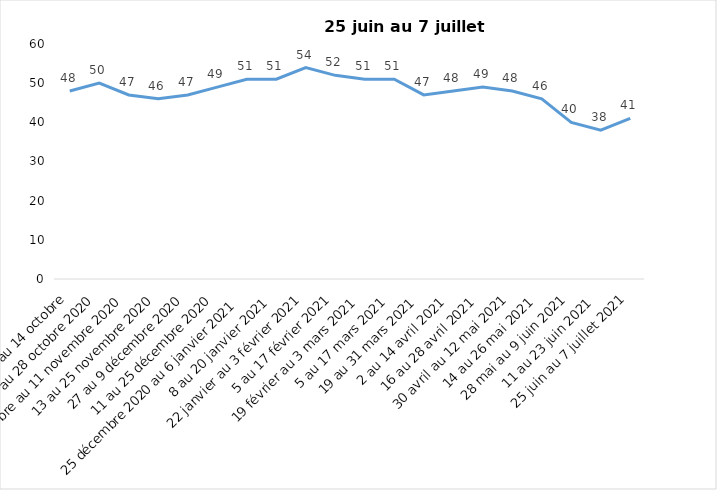
| Category | Toujours aux trois mesures |
|---|---|
| 2 au 14 octobre | 48 |
| 16 au 28 octobre 2020 | 50 |
| 30 octobre au 11 novembre 2020 | 47 |
| 13 au 25 novembre 2020 | 46 |
| 27 au 9 décembre 2020 | 47 |
| 11 au 25 décembre 2020 | 49 |
| 25 décembre 2020 au 6 janvier 2021 | 51 |
| 8 au 20 janvier 2021 | 51 |
| 22 janvier au 3 février 2021 | 54 |
| 5 au 17 février 2021 | 52 |
| 19 février au 3 mars 2021 | 51 |
| 5 au 17 mars 2021 | 51 |
| 19 au 31 mars 2021 | 47 |
| 2 au 14 avril 2021 | 48 |
| 16 au 28 avril 2021 | 49 |
| 30 avril au 12 mai 2021 | 48 |
| 14 au 26 mai 2021 | 46 |
| 28 mai au 9 juin 2021 | 40 |
| 11 au 23 juin 2021 | 38 |
| 25 juin au 7 juillet 2021 | 41 |